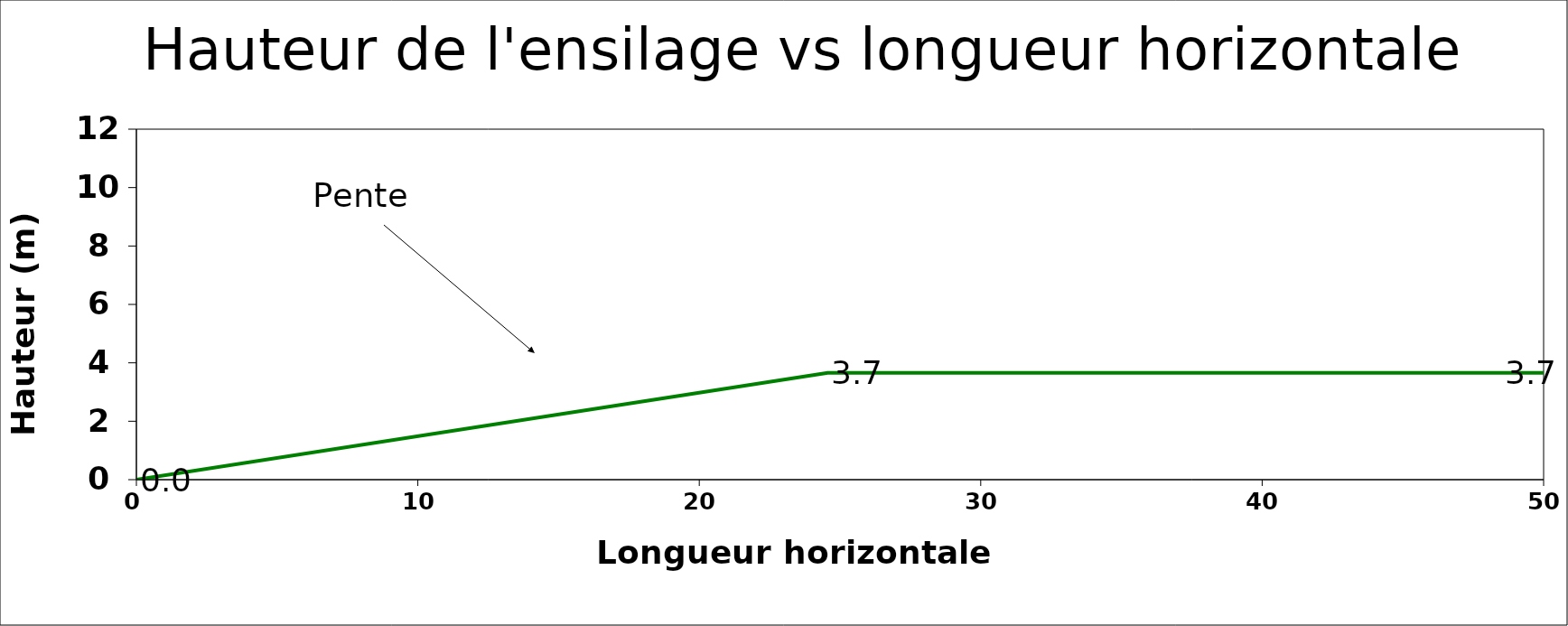
| Category | Cross Section |
|---|---|
| 0.0 | 0 |
| 24.562621846177265 | 3.66 |
| 50.0 | 3.66 |